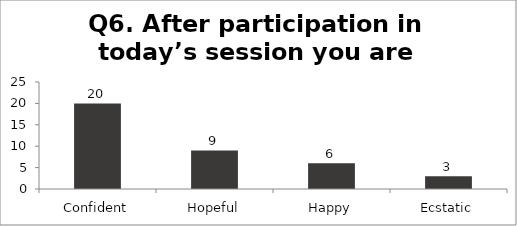
| Category | Q6. After participation in today’s session you are feeling? |
|---|---|
| Confident | 20 |
| Hopeful | 9 |
| Happy | 6 |
| Ecstatic | 3 |